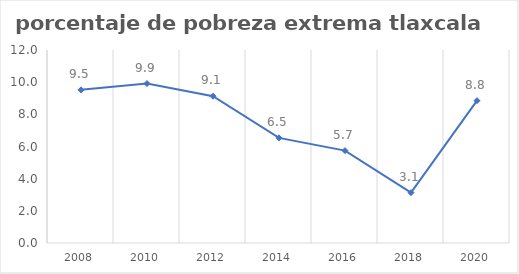
| Category | Series 0 |
|---|---|
| 2008.0 | 9.521 |
| 2010.0 | 9.915 |
| 2012.0 | 9.126 |
| 2014.0 | 6.535 |
| 2016.0 | 5.744 |
| 2018.0 | 3.128 |
| 2020.0 | 8.847 |